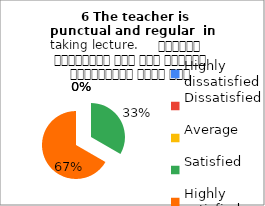
| Category |    6 The teacher is 
punctual and regular  in taking lecture.     शिक्षक समयनिष्ठ हैं एवं नियमित व्याख्यान देते हैं |
|---|---|
| Highly dissatisfied | 0 |
| Dissatisfied | 0 |
| Average | 0 |
| Satisfied | 5 |
| Highly satisfied | 10 |